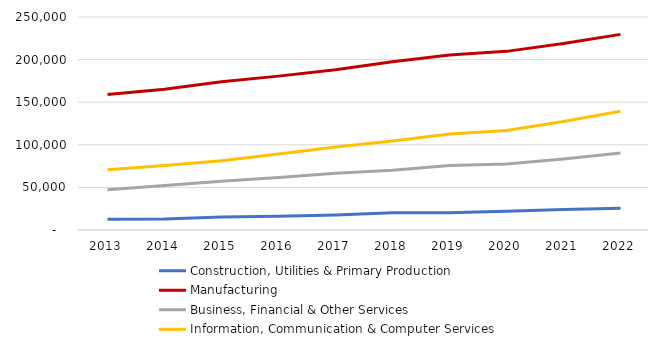
| Category | Construction, Utilities & Primary Production  | Manufacturing  | Business, Financial & Other Services | Information, Communication & Computer Services |
|---|---|---|---|---|
| 2013.0 | 12593 | 158979 | 47168 | 70614 |
| 2014.0 | 12909 | 165308 | 52262 | 75628 |
| 2015.0 | 15323 | 174121 | 57124 | 81243 |
| 2016.0 | 16073 | 180602 | 61618 | 89074 |
| 2017.0 | 17692 | 188181 | 66583 | 97297 |
| 2018.0 | 20173 | 197505 | 70071 | 104575 |
| 2019.0 | 20271 | 205439 | 75710 | 112560 |
| 2020.0 | 21989 | 209662 | 77514 | 116797 |
| 2021.0 | 23986 | 218777 | 83467 | 127319 |
| 2022.0 | 25657 | 229605 | 90351 | 139365 |